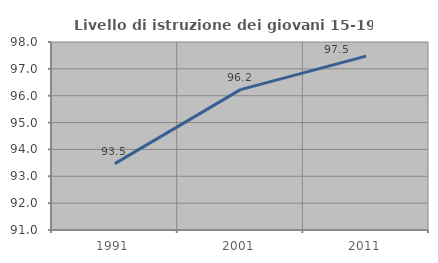
| Category | Livello di istruzione dei giovani 15-19 anni |
|---|---|
| 1991.0 | 93.47 |
| 2001.0 | 96.227 |
| 2011.0 | 97.475 |